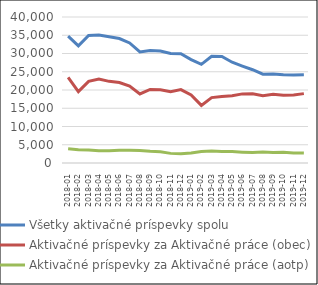
| Category | Všetky aktivačné príspevky spolu | Aktivačné príspevky za Aktivačné práce (obec) | Aktivačné príspevky za Aktivačné práce (aotp) |
|---|---|---|---|
| 2018-01 | 34763 | 23444 | 3889 |
| 2018-02 | 32084 | 19553 | 3613 |
| 2018-03 | 34959 | 22368 | 3585 |
| 2018-04 | 35082 | 23035 | 3334 |
| 2018-05 | 34584 | 22369 | 3330 |
| 2018-06 | 34099 | 22050 | 3477 |
| 2018-07 | 32895 | 21068 | 3474 |
| 2018-08 | 30431 | 18911 | 3433 |
| 2018-09 | 30850 | 20164 | 3201 |
| 2018-10 | 30699 | 20070 | 3053 |
| 2018-11 | 29994 | 19544 | 2637 |
| 2018-12 | 29955 | 20119 | 2551 |
| 2019-01 | 28337 | 18629 | 2739 |
| 2019-02 | 27030 | 15778 | 3158 |
| 2019-03 | 29251 | 17916 | 3281 |
| 2019-04 | 29161 | 18192 | 3159 |
| 2019-05 | 27602 | 18418 | 3131 |
| 2019-06 | 26545 | 18936 | 2974 |
| 2019-07 | 25555 | 18948 | 2875 |
| 2019-08 | 24339 | 18435 | 3010 |
| 2019-09 | 24413 | 18845 | 2906 |
| 2019-10 | 24203 | 18580 | 2922 |
| 2019-11 | 24101 | 18649 | 2773 |
| 2019-12 | 24171 | 19010 | 2707 |